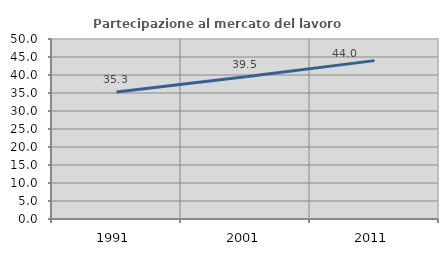
| Category | Partecipazione al mercato del lavoro  femminile |
|---|---|
| 1991.0 | 35.309 |
| 2001.0 | 39.518 |
| 2011.0 | 43.991 |